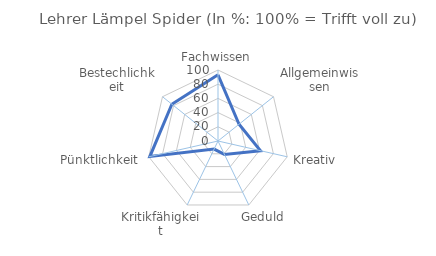
| Category | Series 0 |
|---|---|
| Fachwissen | 93.2 |
| Allgemeinwissen | 37.9 |
| Kreativ | 61.4 |
| Geduld | 21 |
| Kritikfähigkeit | 12.7 |
| Pünktlichkeit | 98.47 |
| Bestechlichkeit | 83.1 |